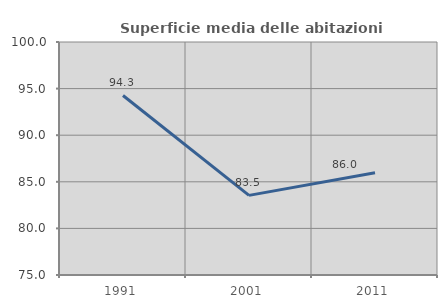
| Category | Superficie media delle abitazioni occupate |
|---|---|
| 1991.0 | 94.264 |
| 2001.0 | 83.542 |
| 2011.0 | 85.976 |